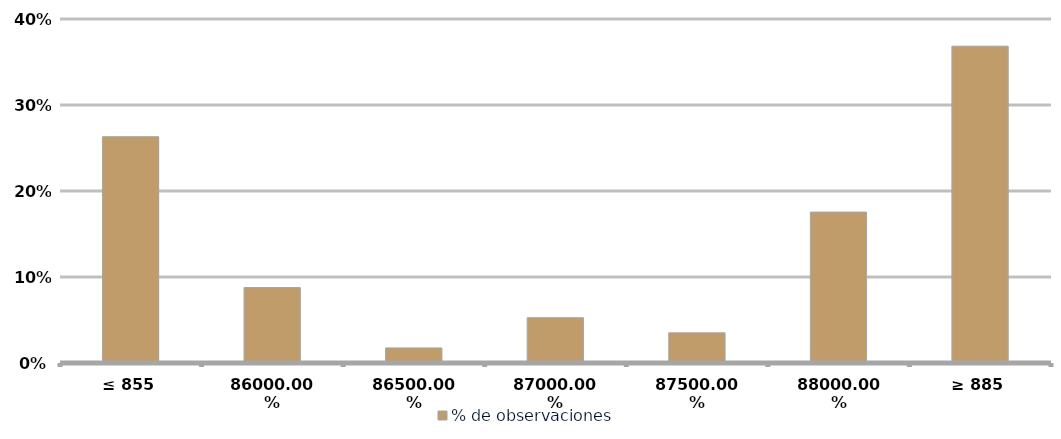
| Category | % de observaciones  |
|---|---|
| ≤ 855 | 0.263 |
| 860 | 0.088 |
| 865 | 0.018 |
| 870 | 0.053 |
| 875 | 0.035 |
| 880 | 0.175 |
| ≥ 885 | 0.368 |